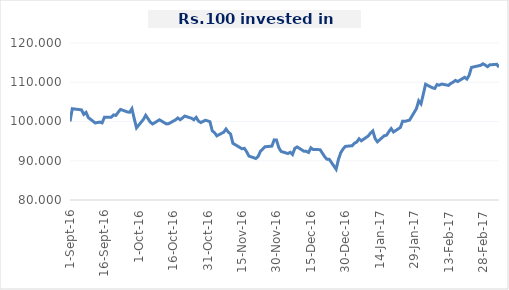
| Category | Series 0 |
|---|---|
| 2016-09-01 | 100 |
| 2016-09-02 | 103.257 |
| 2016-09-06 | 102.962 |
| 2016-09-07 | 101.827 |
| 2016-09-08 | 102.326 |
| 2016-09-09 | 100.99 |
| 2016-09-12 | 99.629 |
| 2016-09-14 | 99.853 |
| 2016-09-15 | 99.65 |
| 2016-09-16 | 101.078 |
| 2016-09-19 | 101.084 |
| 2016-09-20 | 101.671 |
| 2016-09-21 | 101.551 |
| 2016-09-22 | 102.362 |
| 2016-09-23 | 103.077 |
| 2016-09-26 | 102.443 |
| 2016-09-27 | 102.349 |
| 2016-09-28 | 103.252 |
| 2016-09-29 | 100.714 |
| 2016-09-30 | 98.386 |
| 2016-10-03 | 100.529 |
| 2016-10-04 | 101.575 |
| 2016-10-05 | 100.723 |
| 2016-10-06 | 99.843 |
| 2016-10-07 | 99.363 |
| 2016-10-10 | 100.437 |
| 2016-10-13 | 99.382 |
| 2016-10-14 | 99.446 |
| 2016-10-17 | 100.418 |
| 2016-10-18 | 100.902 |
| 2016-10-19 | 100.45 |
| 2016-10-20 | 100.874 |
| 2016-10-21 | 101.383 |
| 2016-10-24 | 100.823 |
| 2016-10-25 | 100.445 |
| 2016-10-26 | 101.05 |
| 2016-10-27 | 100.109 |
| 2016-10-28 | 99.731 |
| 2016-10-30 | 100.328 |
| 2016-11-01 | 99.955 |
| 2016-11-02 | 97.622 |
| 2016-11-03 | 97.154 |
| 2016-11-04 | 96.343 |
| 2016-11-07 | 97.271 |
| 2016-11-08 | 98.084 |
| 2016-11-09 | 97.316 |
| 2016-11-10 | 96.806 |
| 2016-11-11 | 94.446 |
| 2016-11-15 | 93.047 |
| 2016-11-16 | 93.16 |
| 2016-11-17 | 92.294 |
| 2016-11-18 | 91.193 |
| 2016-11-21 | 90.581 |
| 2016-11-22 | 91.095 |
| 2016-11-23 | 92.39 |
| 2016-11-24 | 92.959 |
| 2016-11-25 | 93.565 |
| 2016-11-28 | 93.718 |
| 2016-11-29 | 95.317 |
| 2016-11-30 | 95.275 |
| 2016-12-01 | 93.366 |
| 2016-12-02 | 92.377 |
| 2016-12-05 | 91.837 |
| 2016-12-06 | 92.145 |
| 2016-12-07 | 91.583 |
| 2016-12-08 | 93.167 |
| 2016-12-09 | 93.517 |
| 2016-12-12 | 92.42 |
| 2016-12-13 | 92.403 |
| 2016-12-14 | 92.119 |
| 2016-12-15 | 93.287 |
| 2016-12-16 | 92.844 |
| 2016-12-19 | 92.832 |
| 2016-12-20 | 91.957 |
| 2016-12-21 | 91.038 |
| 2016-12-22 | 90.38 |
| 2016-12-23 | 90.379 |
| 2016-12-26 | 87.83 |
| 2016-12-27 | 90.317 |
| 2016-12-28 | 92.037 |
| 2016-12-29 | 92.953 |
| 2016-12-30 | 93.657 |
| 2017-01-02 | 93.825 |
| 2017-01-03 | 94.488 |
| 2017-01-04 | 94.767 |
| 2017-01-05 | 95.595 |
| 2017-01-06 | 95.078 |
| 2017-01-09 | 96.305 |
| 2017-01-10 | 97.054 |
| 2017-01-11 | 97.599 |
| 2017-01-12 | 95.651 |
| 2017-01-13 | 94.83 |
| 2017-01-16 | 96.38 |
| 2017-01-17 | 96.508 |
| 2017-01-18 | 97.427 |
| 2017-01-19 | 98.196 |
| 2017-01-20 | 97.323 |
| 2017-01-23 | 98.473 |
| 2017-01-24 | 100.083 |
| 2017-01-25 | 100.045 |
| 2017-01-27 | 100.341 |
| 2017-01-30 | 103.268 |
| 2017-01-31 | 105.267 |
| 2017-02-01 | 104.499 |
| 2017-02-02 | 106.95 |
| 2017-02-03 | 109.485 |
| 2017-02-06 | 108.588 |
| 2017-02-07 | 108.423 |
| 2017-02-08 | 109.42 |
| 2017-02-09 | 109.246 |
| 2017-02-10 | 109.542 |
| 2017-02-13 | 109.202 |
| 2017-02-14 | 109.71 |
| 2017-02-15 | 110.017 |
| 2017-02-16 | 110.469 |
| 2017-02-17 | 110.176 |
| 2017-02-20 | 111.259 |
| 2017-02-21 | 110.811 |
| 2017-02-22 | 111.793 |
| 2017-02-23 | 113.785 |
| 2017-02-27 | 114.307 |
| 2017-02-28 | 114.706 |
| 2017-03-01 | 114.379 |
| 2017-03-02 | 113.967 |
| 2017-03-03 | 114.438 |
| 2017-03-06 | 114.572 |
| 2017-03-07 | 113.846 |